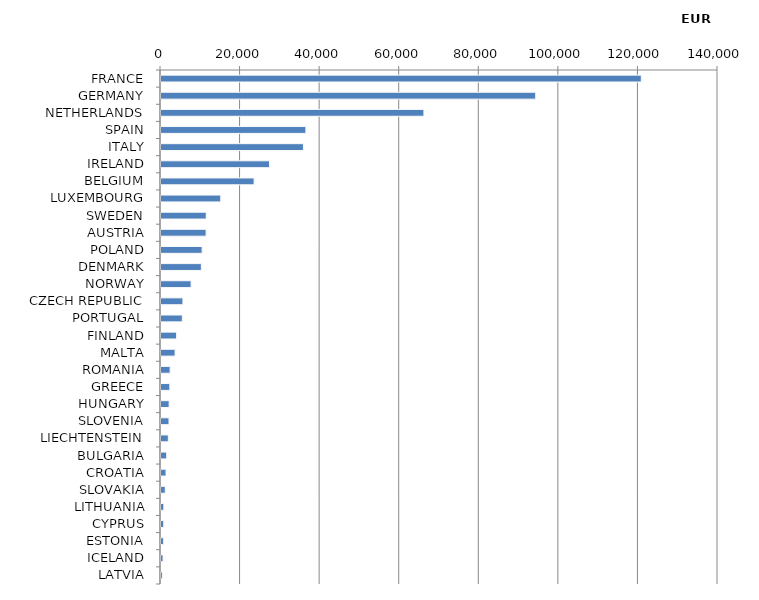
| Category | Series 0 |
|---|---|
| FRANCE | 120719.64 |
| GERMANY | 94181.05 |
| NETHERLANDS | 66081.28 |
| SPAIN | 36417.17 |
| ITALY | 35799.72 |
| IRELAND | 27270.85 |
| BELGIUM | 23400.88 |
| LUXEMBOURG | 15015.79 |
| SWEDEN | 11367.07 |
| AUSTRIA | 11332.49 |
| POLAND | 10338.69 |
| DENMARK | 10138.7 |
| NORWAY | 7565.27 |
| CZECH REPUBLIC | 5511.3 |
| PORTUGAL | 5358.87 |
| FINLAND | 3923.19 |
| MALTA | 3541.95 |
| ROMANIA | 2295.5 |
| GREECE | 2221.64 |
| HUNGARY | 2048.97 |
| SLOVENIA | 2010.58 |
| LIECHTENSTEIN | 1840.09 |
| BULGARIA | 1436.32 |
| CROATIA | 1260.91 |
| SLOVAKIA | 1075.01 |
| LITHUANIA | 715.01 |
| CYPRUS | 695.41 |
| ESTONIA | 674.5 |
| ICELAND | 520.77 |
| LATVIA | 351.54 |